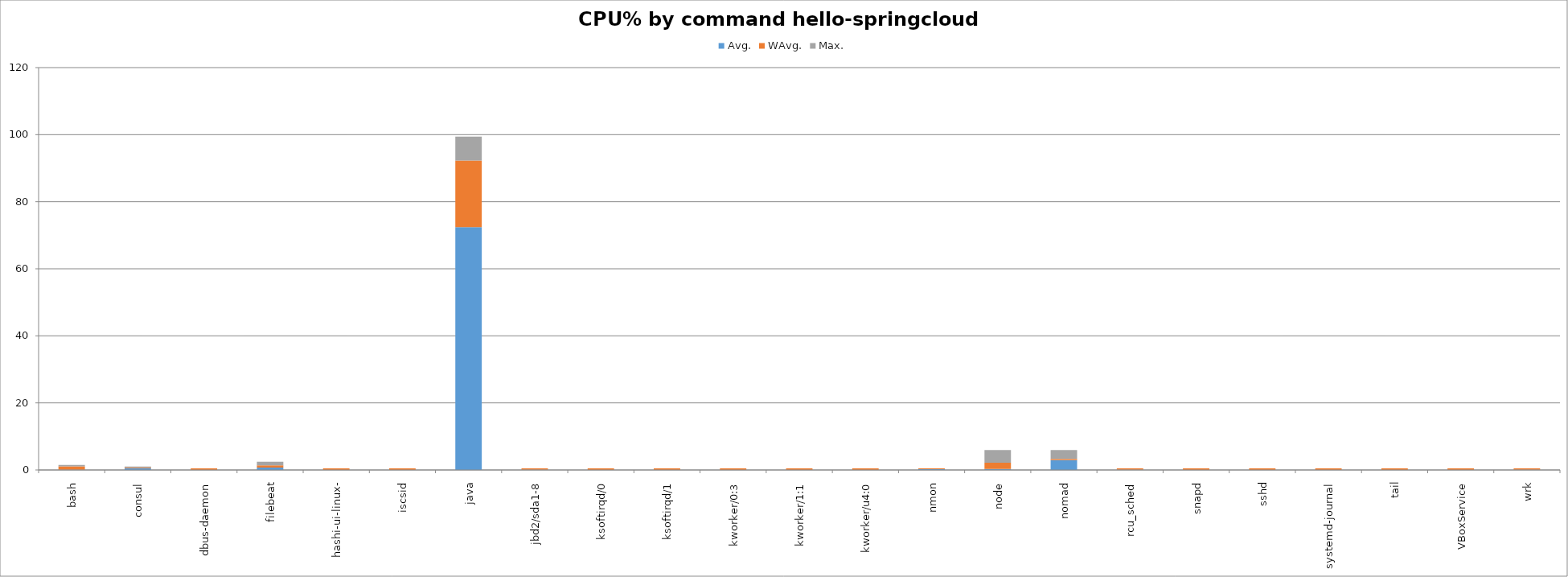
| Category | Avg. | WAvg. | Max. |
|---|---|---|---|
| bash | 0.031 | 1.051 | 0.394 |
| consul | 0.555 | 0.191 | 0.249 |
| dbus-daemon | 0.006 | 0.484 | 0 |
| filebeat | 0.744 | 0.609 | 1.116 |
| hashi-ui-linux- | 0.019 | 0.476 | 0 |
| iscsid | 0.012 | 0.48 | 0.002 |
| java | 72.401 | 19.871 | 7.178 |
| jbd2/sda1-8 | 0.049 | 0.443 | 0.003 |
| ksoftirqd/0 | 0.006 | 0.489 | 0 |
| ksoftirqd/1 | 0.012 | 0.468 | 0.01 |
| kworker/0:3 | 0.012 | 0.483 | 0 |
| kworker/1:1 | 0.006 | 0.484 | 0 |
| kworker/u4:0 | 0.006 | 0.489 | 0 |
| nmon | 0.24 | 0.253 | 0.002 |
| node | 0.315 | 1.87 | 3.751 |
| nomad | 2.926 | 0.387 | 2.627 |
| rcu_sched | 0.049 | 0.443 | 0.003 |
| snapd | 0.006 | 0.489 | 0 |
| sshd | 0.012 | 0.483 | 0 |
| systemd-journal | 0.006 | 0.484 | 0 |
| tail | 0.006 | 0.489 | 0 |
| VBoxService | 0.006 | 0.489 | 0 |
| wrk | 0.086 | 0.406 | 0.003 |